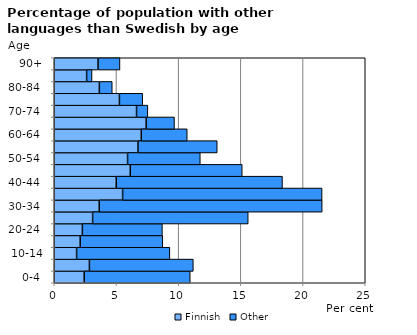
| Category | Finnish | Other |
|---|---|---|
|   0-4  | 2.407 | 8.523 |
|   5-9  | 2.826 | 8.354 |
| 10-14 | 1.797 | 7.497 |
| 15-19  | 2.086 | 6.637 |
| 20-24  | 2.261 | 6.431 |
| 25-29  | 3.084 | 12.507 |
| 30-34  | 3.619 | 17.921 |
| 35-39  | 5.496 | 16.034 |
| 40-44  | 4.984 | 13.362 |
| 45-49  | 6.112 | 8.999 |
| 50-54  | 5.894 | 5.846 |
| 55-59  | 6.732 | 6.37 |
| 60-64  | 6.995 | 3.695 |
| 65-69  | 7.39 | 2.274 |
| 70-74  | 6.614 | 0.91 |
| 75-79  | 5.239 | 1.871 |
| 80-84  | 3.627 | 1.036 |
| 85-89  | 2.603 | 0.434 |
| 90+ | 3.521 | 1.761 |